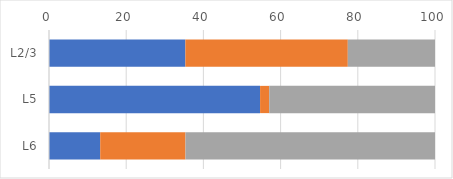
| Category | Series 0 | Series 1 | Series 2 |
|---|---|---|---|
| L2/3 | 35.332 | 42.08 | 22.587 |
| L5 | 54.686 | 2.374 | 42.941 |
| L6 | 13.268 | 22.09 | 64.641 |